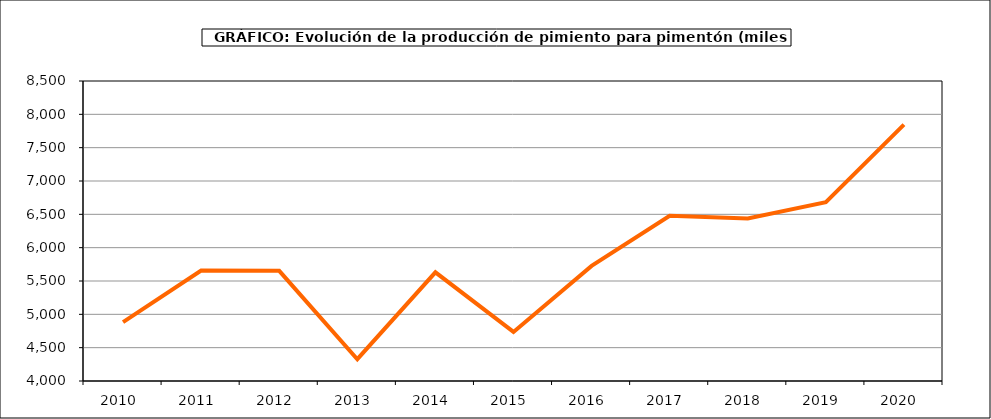
| Category | Producción |
|---|---|
| 2010.0 | 4882 |
| 2011.0 | 5658 |
| 2012.0 | 5652 |
| 2013.0 | 4327 |
| 2014.0 | 5630 |
| 2015.0 | 4736 |
| 2016.0 | 5726 |
| 2017.0 | 6478 |
| 2018.0 | 6439 |
| 2019.0 | 6683 |
| 2020.0 | 7845 |